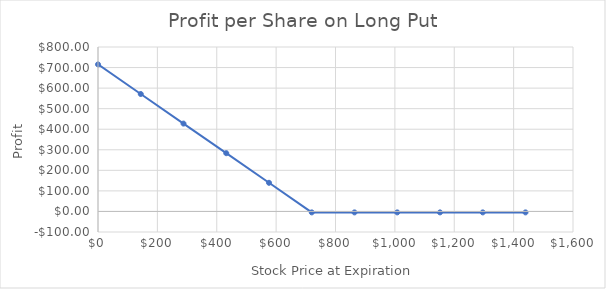
| Category | Profit per Share |
|---|---|
| 0.0 | 715.4 |
| 144.0 | 571.4 |
| 288.0 | 427.4 |
| 432.0 | 283.4 |
| 576.0 | 139.4 |
| 720.0 | -4.6 |
| 864.0 | -4.6 |
| 1007.9999999999999 | -4.6 |
| 1152.0 | -4.6 |
| 1296.0 | -4.6 |
| 1440.0 | -4.6 |